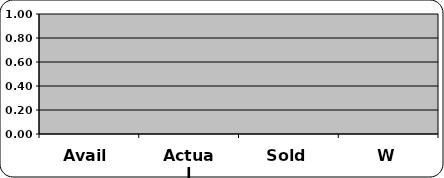
| Category | TOTAL |
|---|---|
| Avail | 0 |
| Actual | 0 |
| Sold | 0 |
| W | 0 |